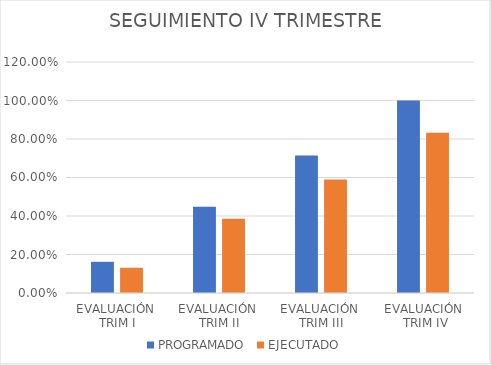
| Category | PROGRAMADO | EJECUTADO |
|---|---|---|
| EVALUACIÓN 
TRIM I | 0.162 | 0.131 |
| EVALUACIÓN 
TRIM II | 0.448 | 0.386 |
| EVALUACIÓN 
TRIM III | 0.714 | 0.59 |
| EVALUACIÓN
 TRIM IV | 1 | 0.832 |